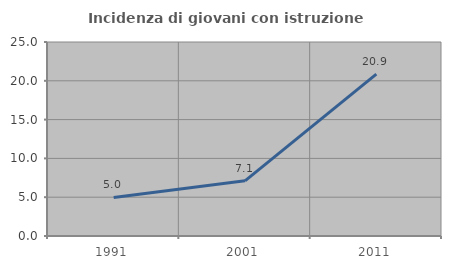
| Category | Incidenza di giovani con istruzione universitaria |
|---|---|
| 1991.0 | 4.975 |
| 2001.0 | 7.107 |
| 2011.0 | 20.87 |